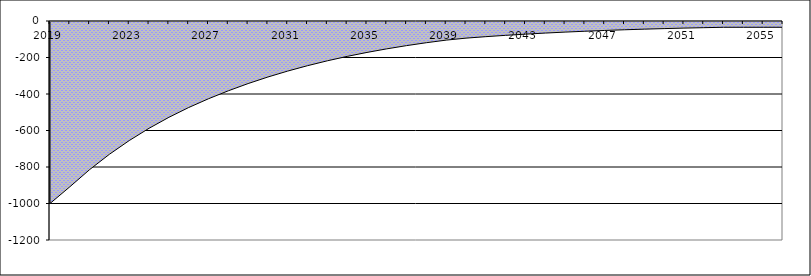
| Category | Series 0 |
|---|---|
| 2019.0 | -1000 |
| 2020.0 | -908.565 |
| 2021.0 | -814.352 |
| 2022.0 | -730.225 |
| 2023.0 | -655.064 |
| 2024.0 | -587.898 |
| 2025.0 | -527.837 |
| 2026.0 | -474.087 |
| 2027.0 | -426.089 |
| 2028.0 | -382.468 |
| 2029.0 | -342.855 |
| 2030.0 | -306.914 |
| 2031.0 | -274.332 |
| 2032.0 | -244.825 |
| 2033.0 | -218.128 |
| 2034.0 | -194 |
| 2035.0 | -172.218 |
| 2036.0 | -152.58 |
| 2037.0 | -134.897 |
| 2038.0 | -118.998 |
| 2039.0 | -104.724 |
| 2040.0 | -93.861 |
| 2041.0 | -85.815 |
| 2042.0 | -78.555 |
| 2043.0 | -72.013 |
| 2044.0 | -66.125 |
| 2045.0 | -60.834 |
| 2046.0 | -56.086 |
| 2047.0 | -51.834 |
| 2048.0 | -48.033 |
| 2049.0 | -44.641 |
| 2050.0 | -41.622 |
| 2051.0 | -38.941 |
| 2052.0 | -36.567 |
| 2053.0 | -34.471 |
| 2054.0 | -34.471 |
| 2055.0 | -34.471 |
| 2056.0 | -34.471 |